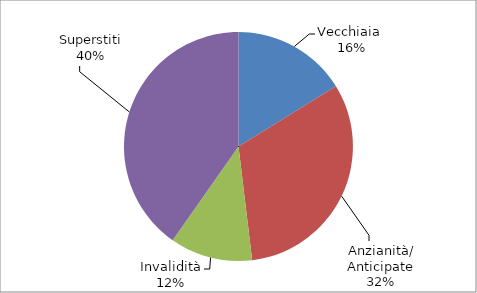
| Category | Series 0 |
|---|---|
| Vecchiaia  | 49280 |
| Anzianità/ Anticipate | 97034 |
| Invalidità | 35474 |
| Superstiti | 122429 |